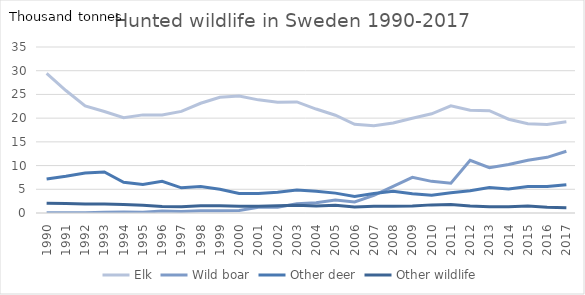
| Category | Elk | Wild boar | Other deer | Other wildlife |
|---|---|---|---|---|
| 1990.0 | 29.419 | 0.038 | 7.172 | 2.046 |
| 1991.0 | 25.82 | 0.066 | 7.734 | 1.982 |
| 1992.0 | 22.557 | 0.073 | 8.416 | 1.874 |
| 1993.0 | 21.392 | 0.178 | 8.637 | 1.893 |
| 1994.0 | 20.085 | 0.187 | 6.471 | 1.78 |
| 1995.0 | 20.689 | 0.171 | 6.024 | 1.61 |
| 1996.0 | 20.675 | 0.422 | 6.671 | 1.367 |
| 1997.0 | 21.424 | 0.342 | 5.309 | 1.325 |
| 1998.0 | 23.138 | 0.455 | 5.57 | 1.51 |
| 1999.0 | 24.402 | 0.477 | 4.998 | 1.531 |
| 2000.0 | 24.672 | 0.537 | 4.104 | 1.434 |
| 2001.0 | 23.855 | 1.198 | 4.132 | 1.438 |
| 2002.0 | 23.348 | 1.222 | 4.352 | 1.534 |
| 2003.0 | 23.423 | 1.937 | 4.853 | 1.654 |
| 2004.0 | 21.92 | 2.139 | 4.574 | 1.484 |
| 2005.0 | 20.615 | 2.732 | 4.192 | 1.655 |
| 2006.0 | 18.698 | 2.328 | 3.46 | 1.278 |
| 2007.0 | 18.381 | 3.733 | 4.133 | 1.421 |
| 2008.0 | 18.967 | 5.633 | 4.588 | 1.441 |
| 2009.0 | 19.979 | 7.509 | 4.062 | 1.491 |
| 2010.0 | 20.914 | 6.672 | 3.746 | 1.713 |
| 2011.0 | 22.585 | 6.262 | 4.247 | 1.812 |
| 2012.0 | 21.659 | 11.091 | 4.682 | 1.461 |
| 2013.0 | 21.582 | 9.562 | 5.383 | 1.337 |
| 2014.0 | 19.77 | 10.219 | 5.078 | 1.325 |
| 2015.0 | 18.84 | 11.129 | 5.594 | 1.463 |
| 2016.0 | 18.641 | 11.733 | 5.569 | 1.201 |
| 2017.0 | 19.239 | 13.018 | 5.969 | 1.116 |